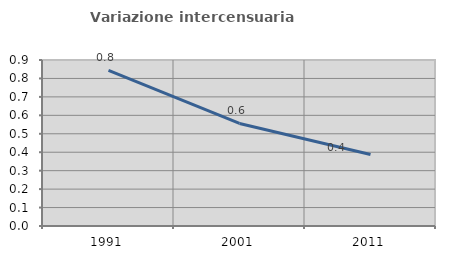
| Category | Variazione intercensuaria annua |
|---|---|
| 1991.0 | 0.844 |
| 2001.0 | 0.556 |
| 2011.0 | 0.388 |